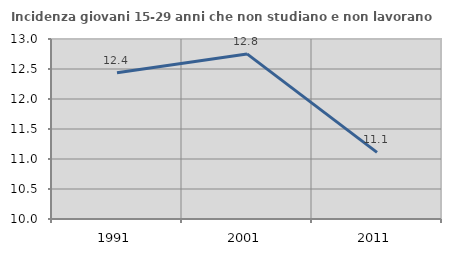
| Category | Incidenza giovani 15-29 anni che non studiano e non lavorano  |
|---|---|
| 1991.0 | 12.436 |
| 2001.0 | 12.752 |
| 2011.0 | 11.111 |